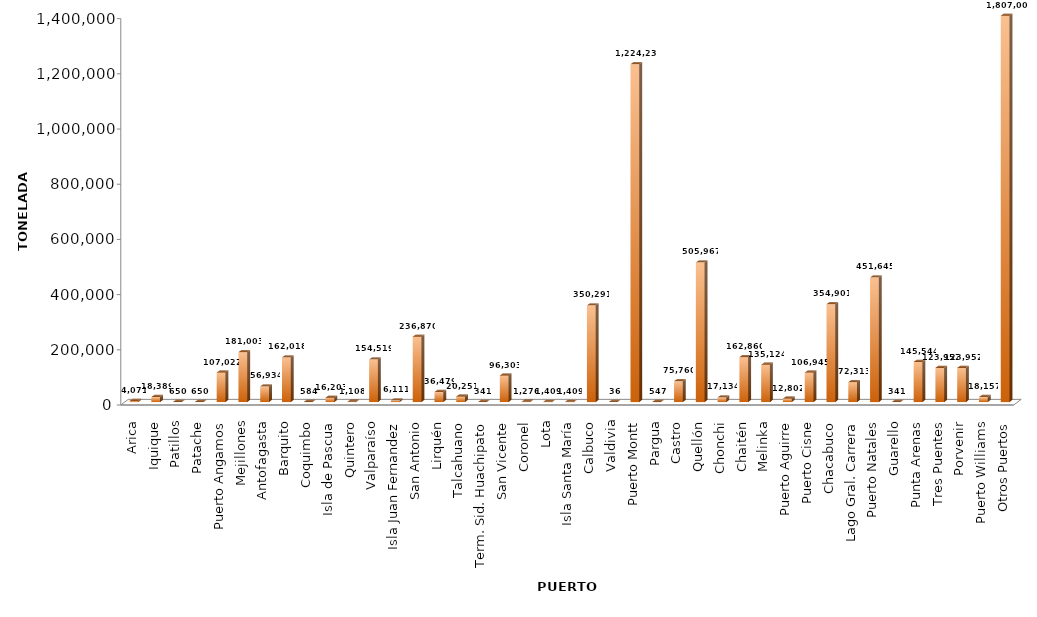
| Category | Series 0 |
|---|---|
| Arica | 4071 |
| Iquique | 18388.6 |
| Patillos | 650 |
| Patache | 650 |
| Puerto Angamos | 107022.287 |
| Mejillones | 181003 |
| Antofagasta | 56934 |
| Barquito | 162017.879 |
| Coquimbo | 584 |
| Isla de Pascua | 16203 |
| Quintero | 1108 |
| Valparaíso | 154519.2 |
| Isla Juan Fernandez | 6111 |
| San Antonio | 236870.392 |
| Lirquén | 36479 |
| Talcahuano | 20251 |
| Term. Sid. Huachipato | 341.171 |
| San Vicente | 96303 |
| Coronel | 1276 |
| Lota | 1409 |
| Isla Santa María | 1409 |
| Calbuco | 350291 |
| Valdivia | 36 |
| Puerto Montt | 1224238 |
| Pargua | 547 |
| Castro | 75760 |
| Quellón | 505967 |
| Chonchi | 17134 |
| Chaitén | 162860 |
| Melinka | 135124 |
| Puerto Aguirre | 12801.6 |
| Puerto Cisne | 106945 |
| Chacabuco | 354900.9 |
| Lago Gral. Carrera | 72313 |
| Puerto Natales | 451645 |
| Guarello | 341.171 |
| Punta Arenas | 145544 |
| Tres Puentes | 123952 |
| Porvenir | 123952 |
| Puerto Williams | 18157 |
| Otros Puertos | 1806999.7 |